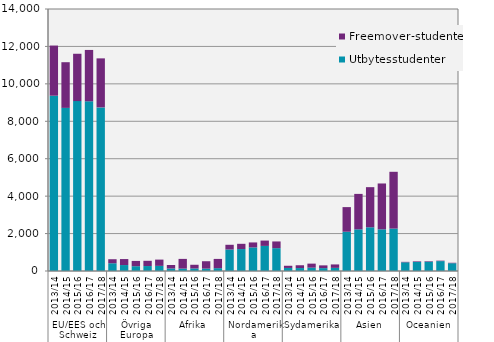
| Category | Utbytesstudenter | Freemover-studenter |
|---|---|---|
| 0 | 9367 | 2679 |
| 1 | 8717 | 2440 |
| 2 | 9080 | 2528 |
| 3 | 9068 | 2744 |
| 4 | 8742 | 2620 |
| 5 | 414 | 215 |
| 6 | 318 | 320 |
| 7 | 256 | 282 |
| 8 | 265 | 280 |
| 9 | 274 | 335 |
| 10 | 135 | 186 |
| 11 | 129 | 518 |
| 12 | 135 | 198 |
| 13 | 128 | 394 |
| 14 | 151 | 495 |
| 15 | 1150 | 251 |
| 16 | 1173 | 280 |
| 17 | 1260 | 266 |
| 18 | 1341 | 285 |
| 19 | 1221 | 358 |
| 20 | 163 | 117 |
| 21 | 158 | 149 |
| 22 | 178 | 216 |
| 23 | 154 | 147 |
| 24 | 168 | 183 |
| 25 | 2099 | 1315 |
| 26 | 2227 | 1893 |
| 27 | 2336 | 2144 |
| 28 | 2227 | 2450 |
| 29 | 2267 | 3034 |
| 30 | 464 | 25 |
| 31 | 486 | 31 |
| 32 | 497 | 28 |
| 33 | 528 | 25 |
| 34 | 416 | 24 |